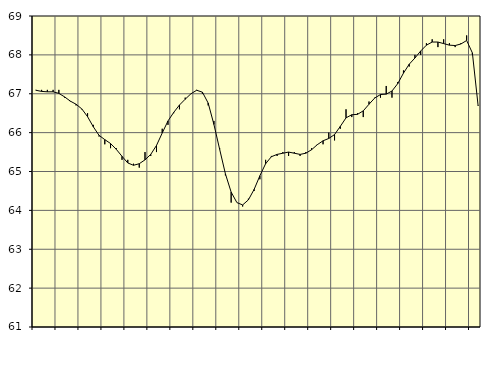
| Category | Piggar | Series 1 |
|---|---|---|
| nan | 67.1 | 67.09 |
| 1.0 | 67.1 | 67.06 |
| 1.0 | 67.1 | 67.05 |
| 1.0 | 67.1 | 67.05 |
| nan | 67.1 | 67.01 |
| 2.0 | 66.9 | 66.92 |
| 2.0 | 66.8 | 66.81 |
| 2.0 | 66.7 | 66.73 |
| nan | 66.6 | 66.61 |
| 3.0 | 66.5 | 66.41 |
| 3.0 | 66.2 | 66.15 |
| 3.0 | 65.9 | 65.93 |
| nan | 65.7 | 65.82 |
| 4.0 | 65.6 | 65.72 |
| 4.0 | 65.6 | 65.57 |
| 4.0 | 65.3 | 65.39 |
| nan | 65.3 | 65.22 |
| 5.0 | 65.2 | 65.16 |
| 5.0 | 65.1 | 65.2 |
| 5.0 | 65.5 | 65.3 |
| nan | 65.4 | 65.44 |
| 6.0 | 65.5 | 65.67 |
| 6.0 | 66.1 | 65.99 |
| 6.0 | 66.2 | 66.3 |
| nan | 66.5 | 66.52 |
| 7.0 | 66.6 | 66.71 |
| 7.0 | 66.9 | 66.86 |
| 7.0 | 67 | 67 |
| nan | 67.1 | 67.09 |
| 8.0 | 67 | 67.04 |
| 8.0 | 66.7 | 66.76 |
| 8.0 | 66.3 | 66.21 |
| nan | 65.6 | 65.57 |
| 9.0 | 64.9 | 64.94 |
| 9.0 | 64.2 | 64.47 |
| 9.0 | 64.2 | 64.2 |
| nan | 64.1 | 64.14 |
| 10.0 | 64.3 | 64.27 |
| 10.0 | 64.5 | 64.54 |
| 10.0 | 64.8 | 64.89 |
| nan | 65.3 | 65.2 |
| 11.0 | 65.4 | 65.38 |
| 11.0 | 65.4 | 65.44 |
| 11.0 | 65.5 | 65.47 |
| nan | 65.4 | 65.5 |
| 12.0 | 65.5 | 65.47 |
| 12.0 | 65.4 | 65.44 |
| 12.0 | 65.5 | 65.47 |
| nan | 65.6 | 65.56 |
| 13.0 | 65.7 | 65.69 |
| 13.0 | 65.7 | 65.79 |
| 13.0 | 66 | 65.85 |
| nan | 65.8 | 65.95 |
| 14.0 | 66.1 | 66.16 |
| 14.0 | 66.6 | 66.38 |
| 14.0 | 66.4 | 66.46 |
| nan | 66.5 | 66.47 |
| 15.0 | 66.4 | 66.56 |
| 15.0 | 66.8 | 66.73 |
| 15.0 | 66.9 | 66.89 |
| nan | 66.9 | 66.98 |
| 16.0 | 67.2 | 66.99 |
| 16.0 | 66.9 | 67.07 |
| 16.0 | 67.3 | 67.26 |
| nan | 67.6 | 67.53 |
| 17.0 | 67.7 | 67.76 |
| 17.0 | 68 | 67.92 |
| 17.0 | 68 | 68.1 |
| nan | 68.3 | 68.25 |
| 18.0 | 68.4 | 68.33 |
| 18.0 | 68.2 | 68.33 |
| 18.0 | 68.4 | 68.29 |
| nan | 68.3 | 68.25 |
| 19.0 | 68.2 | 68.24 |
| 19.0 | 68.3 | 68.28 |
| 19.0 | 68.5 | 68.37 |
| nan | 68 | 68.05 |
| 20.0 | 66.7 | 66.69 |